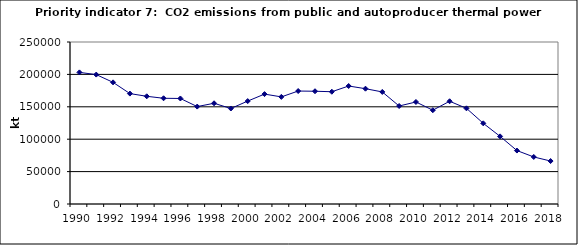
| Category | CO2 emissions from public and autoproducer thermal power stations, kt |
|---|---|
| 1990 | 203115.85 |
| 1991 | 199721.534 |
| 1992 | 187719.121 |
| 1993 | 170385.131 |
| 1994 | 166212.714 |
| 1995 | 163159.198 |
| 1996 | 162836.608 |
| 1997 | 150330.59 |
| 1998 | 155430.957 |
| 1999 | 147398.525 |
| 2000 | 158824.197 |
| 2001 | 169590.288 |
| 2002 | 165293.373 |
| 2003 | 174329.252 |
| 2004 | 174003.716 |
| 2005 | 173265.789 |
| 2006 | 182074.674 |
| 2007 | 177931.929 |
| 2008 | 172931.354 |
| 2009 | 151214.508 |
| 2010 | 157453.812 |
| 2011 | 144737.876 |
| 2012 | 158558.606 |
| 2013 | 147644.138 |
| 2014 | 124512.655 |
| 2015 | 104335.573 |
| 2016 | 82489.225 |
| 2017 | 72594.537 |
| 2018 | 66308.027 |